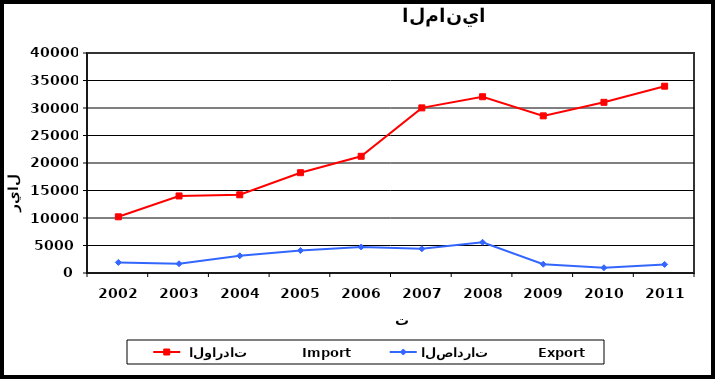
| Category |  الواردات           Import | الصادرات          Export |
|---|---|---|
| 2002.0 | 10217 | 1924 |
| 2003.0 | 14009 | 1682 |
| 2004.0 | 14217 | 3135 |
| 2005.0 | 18238 | 4086 |
| 2006.0 | 21223 | 4729 |
| 2007.0 | 30022 | 4401 |
| 2008.0 | 32047 | 5588 |
| 2009.0 | 28572 | 1598 |
| 2010.0 | 31032 | 952 |
| 2011.0 | 33964 | 1560 |